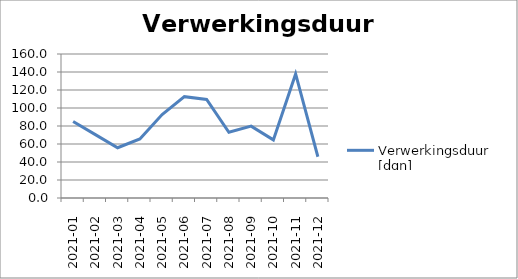
| Category | Verwerkingsduur [dgn] |
|---|---|
| 2021-01 | 84.993 |
| 2021-02 | 70.413 |
| 2021-03 | 55.834 |
| 2021-04 | 65.618 |
| 2021-05 | 92.757 |
| 2021-06 | 112.566 |
| 2021-07 | 109.473 |
| 2021-08 | 73.003 |
| 2021-09 | 79.826 |
| 2021-10 | 64.589 |
| 2021-11 | 137.875 |
| 2021-12 | 45.828 |